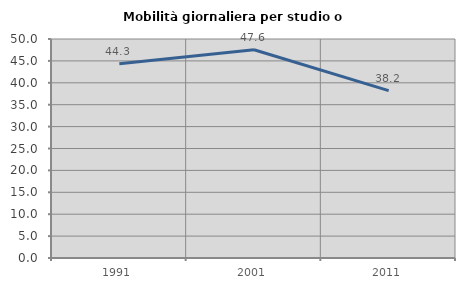
| Category | Mobilità giornaliera per studio o lavoro |
|---|---|
| 1991.0 | 44.333 |
| 2001.0 | 47.556 |
| 2011.0 | 38.223 |